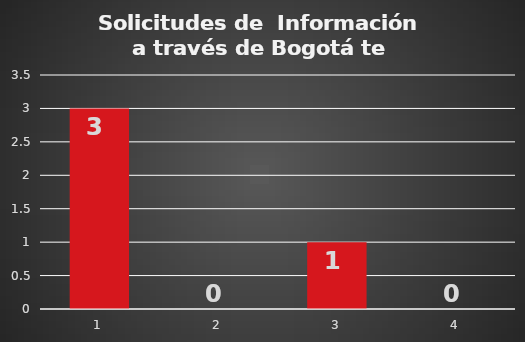
| Category | Series 1 |
|---|---|
| 0 | 3 |
| 1 | 0 |
| 2 | 1 |
| 3 | 0 |